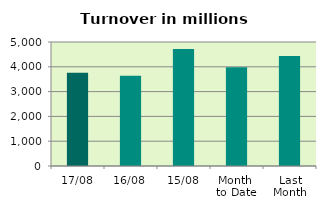
| Category | Series 0 |
|---|---|
| 17/08 | 3756.908 |
| 16/08 | 3638.866 |
| 15/08 | 4722.418 |
| Month 
to Date | 3979.553 |
| Last
Month | 4433.065 |